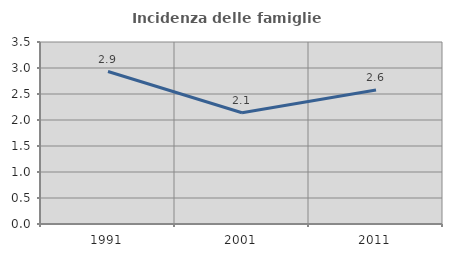
| Category | Incidenza delle famiglie numerose |
|---|---|
| 1991.0 | 2.933 |
| 2001.0 | 2.14 |
| 2011.0 | 2.575 |